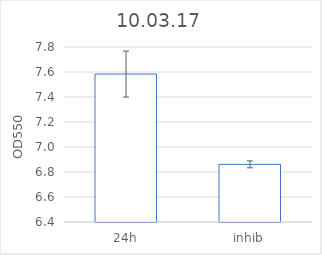
| Category | Series 0 |
|---|---|
| 24h | 7.583 |
| inhib | 6.861 |